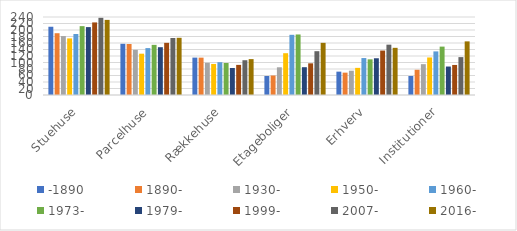
| Category | -1890 | 1890- | 1930- | 1950- | 1960- | 1973- | 1979- | 1999- | 2007- | 2016- |
|---|---|---|---|---|---|---|---|---|---|---|
| Stuehuse | 210.015 | 190.106 | 181.366 | 174.108 | 187.637 | 211.87 | 208.905 | 223.322 | 237.491 | 231.152 |
| Parcelhuse | 157.547 | 156.965 | 138.925 | 127.108 | 144.29 | 154.28 | 147.052 | 160.497 | 175.38 | 175.972 |
| Rækkehuse | 115.065 | 114.94 | 99.022 | 95.547 | 100.915 | 98.431 | 83.132 | 92.657 | 106.999 | 110.449 |
| Etageboliger | 58.537 | 59.977 | 85.251 | 128.601 | 185.223 | 186.255 | 85.515 | 97.455 | 134.795 | 160.498 |
| Erhverv | 71.87 | 68.787 | 74.711 | 83.498 | 113.711 | 109.727 | 113.048 | 136.777 | 154.905 | 145.153 |
| Institutioner | 58.493 | 77.624 | 94.864 | 115.465 | 134.153 | 148.896 | 87.583 | 92.449 | 116.55 | 165.017 |